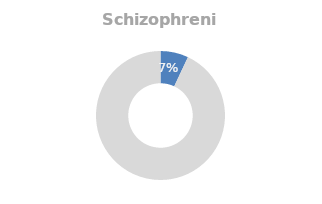
| Category | Schizophrenia |
|---|---|
| 0 | 0.07 |
| 1 | 0.93 |